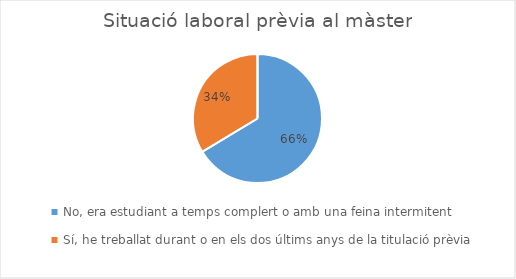
| Category | Series 0 |
|---|---|
| No, era estudiant a temps complert o amb una feina intermitent
 | 77 |
| Sí, he treballat durant o en els dos últims anys de la titulació prèvia | 39 |